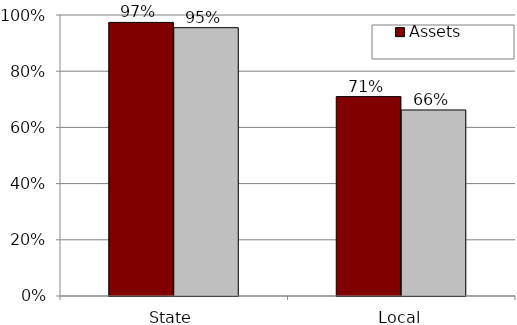
| Category | Assets | Active members |
|---|---|---|
| State | 0.974 | 0.955 |
| Local | 0.71 | 0.662 |